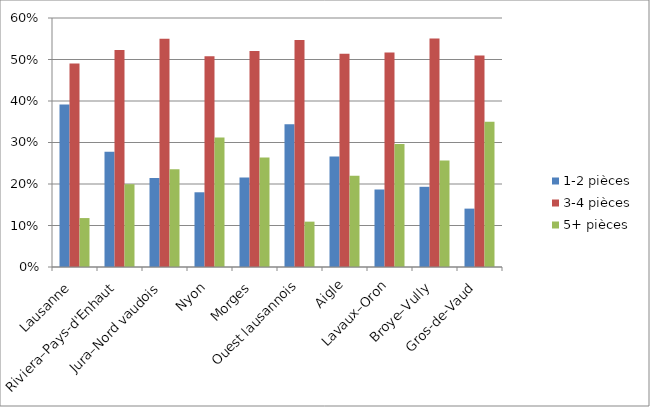
| Category | 1-2 pièces | 3-4 pièces | 5+ pièces |
|---|---|---|---|
| Lausanne | 0.392 | 0.49 | 0.118 |
| Riviera–Pays-d'Enhaut | 0.278 | 0.523 | 0.2 |
| Jura–Nord vaudois | 0.215 | 0.55 | 0.235 |
| Nyon | 0.18 | 0.508 | 0.312 |
| Morges | 0.216 | 0.521 | 0.264 |
| Ouest lausannois | 0.344 | 0.547 | 0.109 |
| Aigle | 0.266 | 0.514 | 0.22 |
| Lavaux–Oron | 0.187 | 0.517 | 0.296 |
| Broye–Vully | 0.193 | 0.55 | 0.256 |
| Gros-de-Vaud | 0.141 | 0.509 | 0.35 |